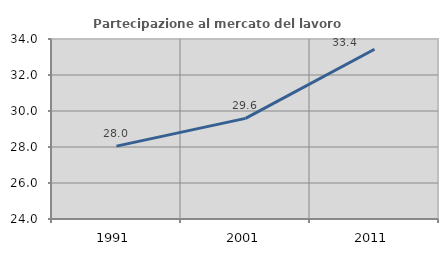
| Category | Partecipazione al mercato del lavoro  femminile |
|---|---|
| 1991.0 | 28.05 |
| 2001.0 | 29.591 |
| 2011.0 | 33.43 |